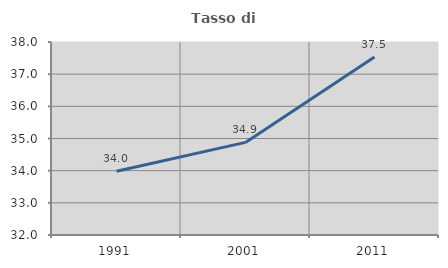
| Category | Tasso di occupazione   |
|---|---|
| 1991.0 | 33.981 |
| 2001.0 | 34.879 |
| 2011.0 | 37.532 |